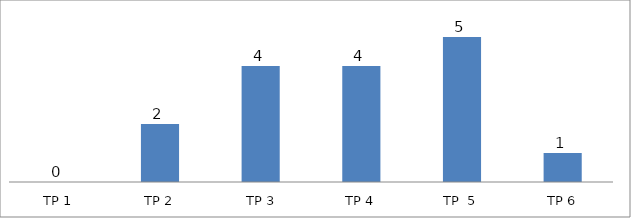
| Category | BIL. MURID |
|---|---|
| TP 1 | 0 |
| TP 2 | 2 |
|  TP 3 | 4 |
| TP 4 | 4 |
| TP  5 | 5 |
| TP 6 | 1 |